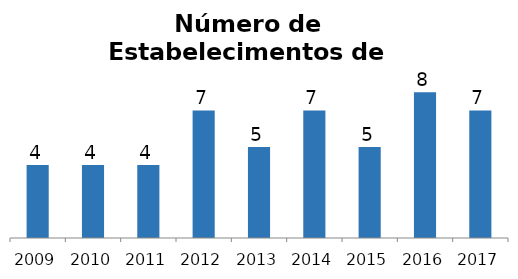
| Category | Agências de Viagem |
|---|---|
| 2009.0 | 4 |
| 2010.0 | 4 |
| 2011.0 | 4 |
| 2012.0 | 7 |
| 2013.0 | 5 |
| 2014.0 | 7 |
| 2015.0 | 5 |
| 2016.0 | 8 |
| 2017.0 | 7 |